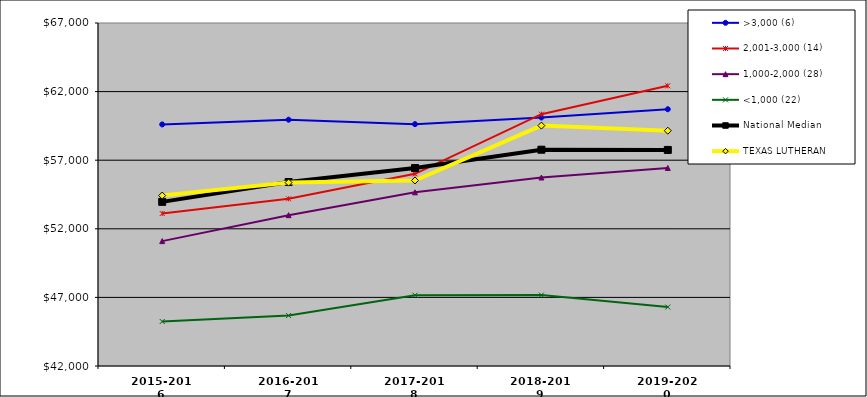
| Category | >3,000 (6) | 2,001-3,000 (14) | 1,000-2,000 (28) | <1,000 (22) | National Median | TEXAS LUTHERAN |
|---|---|---|---|---|---|---|
| 2015-2016 | 59607 | 53113.5 | 51102 | 45243 | 53964 | 54423 |
| 2016-2017 | 59953 | 54187.5 | 52993 | 45676.5 | 55410 | 55368 |
| 2017-2018 | 59629 | 56006.5 | 54658 | 47160 | 56428 | 55522 |
| 2018-2019 | 60111.5 | 60354.5 | 55738 | 47169 | 57764 | 59522 |
| 2019-2020 | 60715 | 62424 | 56432 | 46298 | 57747 | 59150 |